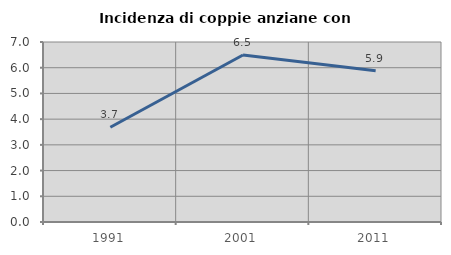
| Category | Incidenza di coppie anziane con figli |
|---|---|
| 1991.0 | 3.684 |
| 2001.0 | 6.494 |
| 2011.0 | 5.882 |